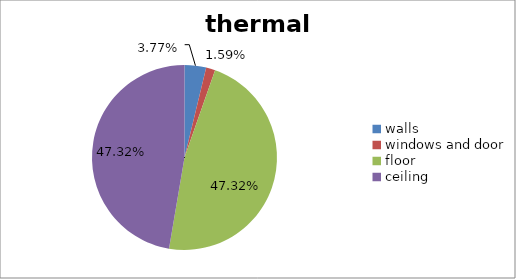
| Category | Series 0 |
|---|---|
| walls | 0.038 |
| windows and door | 0.016 |
| floor | 0.473 |
| ceiling | 0.473 |